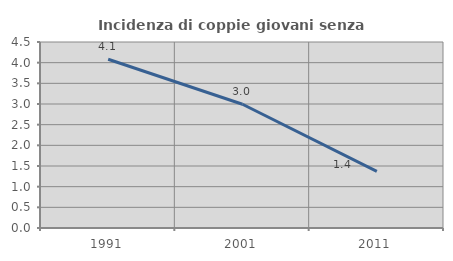
| Category | Incidenza di coppie giovani senza figli |
|---|---|
| 1991.0 | 4.082 |
| 2001.0 | 2.994 |
| 2011.0 | 1.37 |